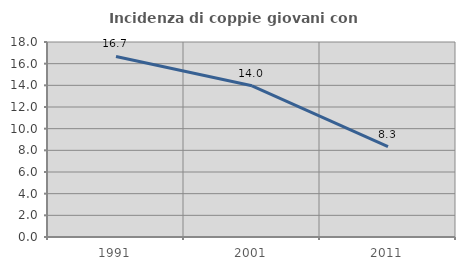
| Category | Incidenza di coppie giovani con figli |
|---|---|
| 1991.0 | 16.667 |
| 2001.0 | 13.953 |
| 2011.0 | 8.333 |